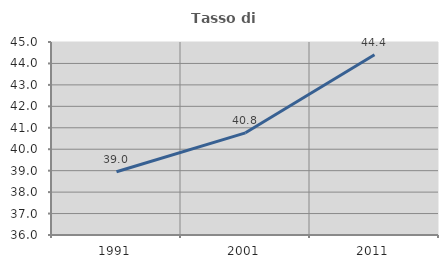
| Category | Tasso di occupazione   |
|---|---|
| 1991.0 | 38.951 |
| 2001.0 | 40.765 |
| 2011.0 | 44.409 |